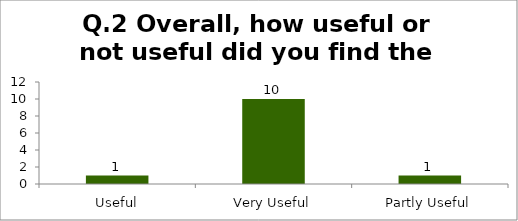
| Category | Q.2 Overall, how useful or not useful did you find the Session? |
|---|---|
| Useful | 1 |
| Very Useful | 10 |
| Partly Useful | 1 |